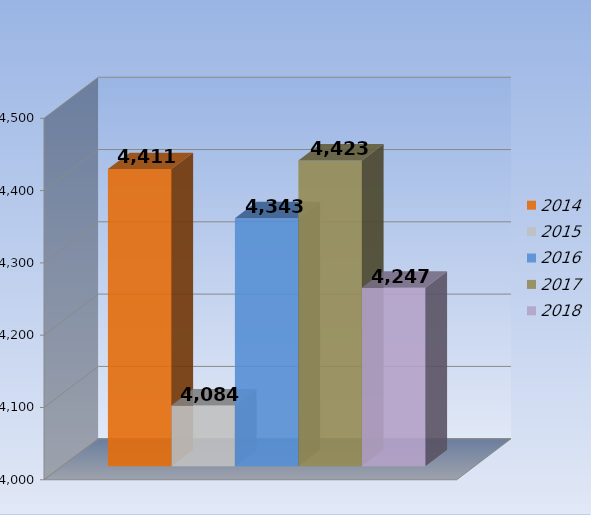
| Category | 2014 | 2015 | 2016 | 2017 | 2018 |
|---|---|---|---|---|---|
| 0 | 4411 | 4084 | 4343 | 4423 | 4247 |